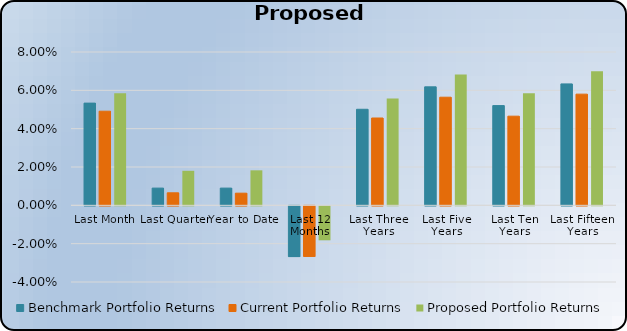
| Category | Benchmark Portfolio Returns | Current Portfolio Returns | Proposed Portfolio Returns |
|---|---|---|---|
| Last Month | 0.053 | 0.049 | 0.059 |
| Last Quarter | 0.009 | 0.007 | 0.018 |
| Year to Date | 0.009 | 0.006 | 0.018 |
| Last 12 Months | -0.026 | -0.026 | -0.018 |
| Last Three Years | 0.05 | 0.046 | 0.056 |
| Last Five Years | 0.062 | 0.056 | 0.068 |
| Last Ten Years | 0.052 | 0.047 | 0.059 |
| Last Fifteen Years | 0.063 | 0.058 | 0.07 |